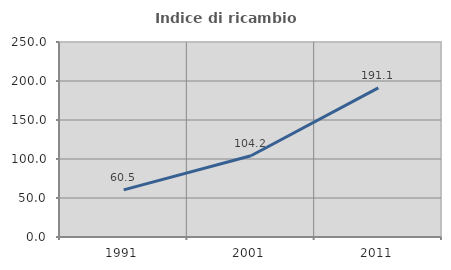
| Category | Indice di ricambio occupazionale  |
|---|---|
| 1991.0 | 60.465 |
| 2001.0 | 104.156 |
| 2011.0 | 191.144 |